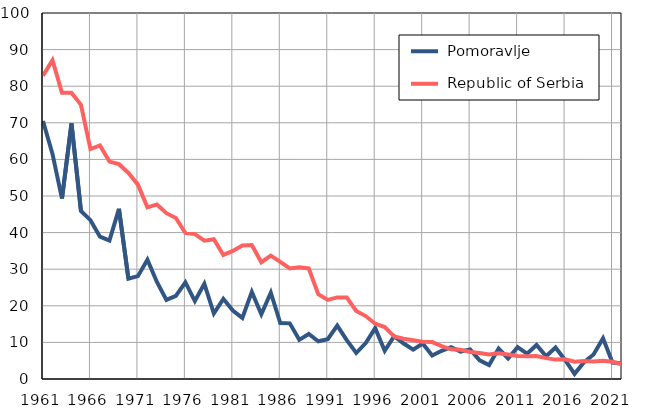
| Category |  Pomoravlje |  Republic of Serbia |
|---|---|---|
| 1961.0 | 70.5 | 82.9 |
| 1962.0 | 61.5 | 87.1 |
| 1963.0 | 49.3 | 78.2 |
| 1964.0 | 69.8 | 78.2 |
| 1965.0 | 45.9 | 74.9 |
| 1966.0 | 43.4 | 62.8 |
| 1967.0 | 38.9 | 63.8 |
| 1968.0 | 37.8 | 59.4 |
| 1969.0 | 46.5 | 58.7 |
| 1970.0 | 27.4 | 56.3 |
| 1971.0 | 28.1 | 53.1 |
| 1972.0 | 32.6 | 46.9 |
| 1973.0 | 26.5 | 47.7 |
| 1974.0 | 21.6 | 45.3 |
| 1975.0 | 22.7 | 44 |
| 1976.0 | 26.4 | 39.9 |
| 1977.0 | 21.3 | 39.6 |
| 1978.0 | 26 | 37.8 |
| 1979.0 | 17.9 | 38.2 |
| 1980.0 | 21.9 | 33.9 |
| 1981.0 | 18.7 | 35 |
| 1982.0 | 16.7 | 36.5 |
| 1983.0 | 23.8 | 36.6 |
| 1984.0 | 17.7 | 31.9 |
| 1985.0 | 23.6 | 33.7 |
| 1986.0 | 15.3 | 32 |
| 1987.0 | 15.2 | 30.2 |
| 1988.0 | 10.7 | 30.5 |
| 1989.0 | 12.3 | 30.2 |
| 1990.0 | 10.3 | 23.2 |
| 1991.0 | 10.9 | 21.6 |
| 1992.0 | 14.6 | 22.3 |
| 1993.0 | 10.6 | 22.3 |
| 1994.0 | 7.1 | 18.6 |
| 1995.0 | 9.8 | 17.2 |
| 1996.0 | 13.9 | 15.1 |
| 1997.0 | 7.7 | 14.2 |
| 1998.0 | 11.7 | 11.6 |
| 1999.0 | 9.7 | 11 |
| 2000.0 | 8 | 10.6 |
| 2001.0 | 9.7 | 10.2 |
| 2002.0 | 6.4 | 10.1 |
| 2003.0 | 7.7 | 9 |
| 2004.0 | 8.7 | 8.1 |
| 2005.0 | 7.5 | 8 |
| 2006.0 | 8.1 | 7.4 |
| 2007.0 | 5.1 | 7.1 |
| 2008.0 | 3.8 | 6.7 |
| 2009.0 | 8.3 | 7 |
| 2010.0 | 5.6 | 6.7 |
| 2011.0 | 8.7 | 6.3 |
| 2012.0 | 6.9 | 6.2 |
| 2013.0 | 9.3 | 6.3 |
| 2014.0 | 6.2 | 5.7 |
| 2015.0 | 8.6 | 5.3 |
| 2016.0 | 5.2 | 5.4 |
| 2017.0 | 1.4 | 4.7 |
| 2018.0 | 4.6 | 4.9 |
| 2019.0 | 6.7 | 4.8 |
| 2020.0 | 11.1 | 5 |
| 2021.0 | 4.5 | 4.7 |
| 2022.0 | 4.3 | 4 |